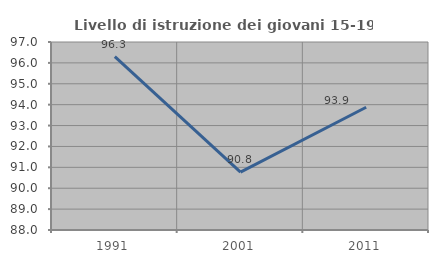
| Category | Livello di istruzione dei giovani 15-19 anni |
|---|---|
| 1991.0 | 96.296 |
| 2001.0 | 90.769 |
| 2011.0 | 93.878 |